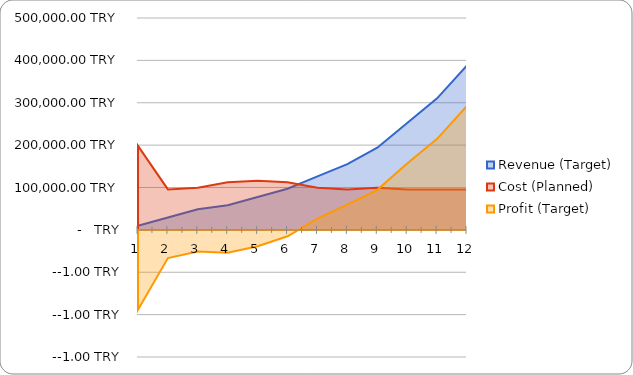
| Category | Revenue (Target) | Cost (Planned) | Profit (Target) |
|---|---|---|---|
| 1.0 | 9700 | 198331.879 | -188631.879 |
| 2.0 | 29100 | 95536.879 | -66436.879 |
| 3.0 | 48500 | 99536.879 | -51036.879 |
| 4.0 | 58200 | 112203.546 | -54003.546 |
| 5.0 | 77600 | 116203.546 | -38603.546 |
| 6.0 | 97000 | 112203.546 | -15203.546 |
| 7.0 | 126100 | 99536.879 | 26563.121 |
| 8.0 | 155200 | 95536.879 | 59663.121 |
| 9.0 | 194000 | 99536.879 | 94463.121 |
| 10.0 | 252200 | 95536.879 | 156663.121 |
| 11.0 | 310400 | 95536.879 | 214863.121 |
| 12.0 | 388000 | 95536.879 | 292463.121 |